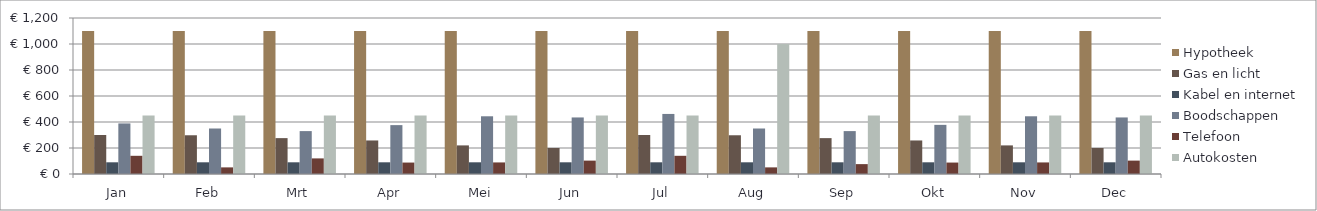
| Category | Hypotheek | Gas en licht | Kabel en internet | Boodschappen | Telefoon | Autokosten |
|---|---|---|---|---|---|---|
| Jan | 1100 | 300 | 90 | 389 | 140 | 450 |
| Feb | 1100 | 298 | 90 | 350 | 50.93 | 450 |
| Mrt | 1100 | 276 | 90 | 330 | 120 | 450 |
| Apr | 1100 | 258 | 90 | 376 | 88 | 450 |
| Mei | 1100 | 220 | 90 | 444 | 89 | 450 |
| Jun | 1100 | 200 | 90 | 435 | 103 | 450 |
| Jul | 1100 | 300 | 90 | 462 | 140 | 450 |
| Aug | 1100 | 298 | 90 | 350 | 50.93 | 1000 |
| Sep | 1100 | 276 | 90 | 330 | 76 | 450 |
| Okt | 1100 | 258 | 90 | 378 | 88 | 450 |
| Nov | 1100 | 220 | 90 | 444 | 89 | 450 |
| Dec | 1100 | 200 | 90 | 435 | 103 | 450 |